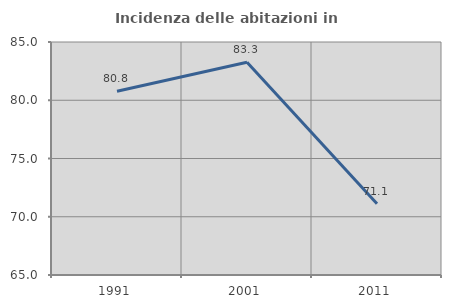
| Category | Incidenza delle abitazioni in proprietà  |
|---|---|
| 1991.0 | 80.769 |
| 2001.0 | 83.257 |
| 2011.0 | 71.124 |